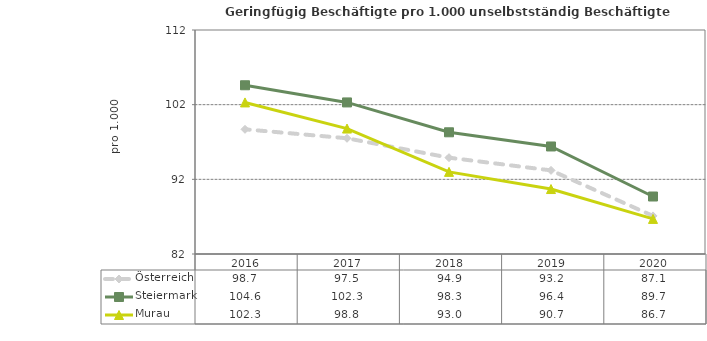
| Category | Österreich | Steiermark | Murau |
|---|---|---|---|
| 2020.0 | 87.1 | 89.7 | 86.7 |
| 2019.0 | 93.2 | 96.4 | 90.7 |
| 2018.0 | 94.9 | 98.3 | 93 |
| 2017.0 | 97.5 | 102.3 | 98.8 |
| 2016.0 | 98.7 | 104.6 | 102.3 |